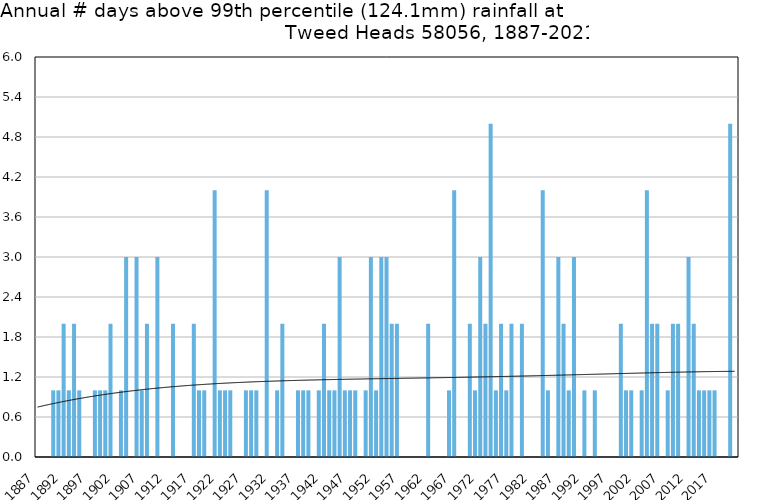
| Category | Annual # days above 99th percentile |
|---|---|
| 1887 | 0 |
| 1888 | 0 |
| 1889 | 0 |
| 1890 | 1 |
| 1891 | 1 |
| 1892 | 2 |
| 1893 | 1 |
| 1894 | 2 |
| 1895 | 1 |
| 1896 | 0 |
| 1897 | 0 |
| 1898 | 1 |
| 1899 | 1 |
| 1900 | 1 |
| 1901 | 2 |
| 1902 | 0 |
| 1903 | 1 |
| 1904 | 3 |
| 1905 | 0 |
| 1906 | 3 |
| 1907 | 1 |
| 1908 | 2 |
| 1909 | 0 |
| 1910 | 3 |
| 1911 | 0 |
| 1912 | 0 |
| 1913 | 2 |
| 1914 | 0 |
| 1915 | 0 |
| 1916 | 0 |
| 1917 | 2 |
| 1918 | 1 |
| 1919 | 1 |
| 1920 | 0 |
| 1921 | 4 |
| 1922 | 1 |
| 1923 | 1 |
| 1924 | 1 |
| 1925 | 0 |
| 1926 | 0 |
| 1927 | 1 |
| 1928 | 1 |
| 1929 | 1 |
| 1930 | 0 |
| 1931 | 4 |
| 1932 | 0 |
| 1933 | 1 |
| 1934 | 2 |
| 1935 | 0 |
| 1936 | 0 |
| 1937 | 1 |
| 1938 | 1 |
| 1939 | 1 |
| 1940 | 0 |
| 1941 | 1 |
| 1942 | 2 |
| 1943 | 1 |
| 1944 | 1 |
| 1945 | 3 |
| 1946 | 1 |
| 1947 | 1 |
| 1948 | 1 |
| 1949 | 0 |
| 1950 | 1 |
| 1951 | 3 |
| 1952 | 1 |
| 1953 | 3 |
| 1954 | 3 |
| 1955 | 2 |
| 1956 | 2 |
| 1957 | 0 |
| 1958 | 0 |
| 1959 | 0 |
| 1960 | 0 |
| 1961 | 0 |
| 1962 | 2 |
| 1963 | 0 |
| 1964 | 0 |
| 1965 | 0 |
| 1966 | 1 |
| 1967 | 4 |
| 1968 | 0 |
| 1969 | 0 |
| 1970 | 2 |
| 1971 | 1 |
| 1972 | 3 |
| 1973 | 2 |
| 1974 | 5 |
| 1975 | 1 |
| 1976 | 2 |
| 1977 | 1 |
| 1978 | 2 |
| 1979 | 0 |
| 1980 | 2 |
| 1981 | 0 |
| 1982 | 0 |
| 1983 | 0 |
| 1984 | 4 |
| 1985 | 1 |
| 1986 | 0 |
| 1987 | 3 |
| 1988 | 2 |
| 1989 | 1 |
| 1990 | 3 |
| 1991 | 0 |
| 1992 | 1 |
| 1993 | 0 |
| 1994 | 1 |
| 1995 | 0 |
| 1996 | 0 |
| 1997 | 0 |
| 1998 | 0 |
| 1999 | 2 |
| 2000 | 1 |
| 2001 | 1 |
| 2002 | 0 |
| 2003 | 1 |
| 2004 | 4 |
| 2005 | 2 |
| 2006 | 2 |
| 2007 | 0 |
| 2008 | 1 |
| 2009 | 2 |
| 2010 | 2 |
| 2011 | 0 |
| 2012 | 3 |
| 2013 | 2 |
| 2014 | 1 |
| 2015 | 1 |
| 2016 | 1 |
| 2017 | 1 |
| 2018 | 0 |
| 2019 | 0 |
| 2020 | 5 |
| 2021 | 0 |